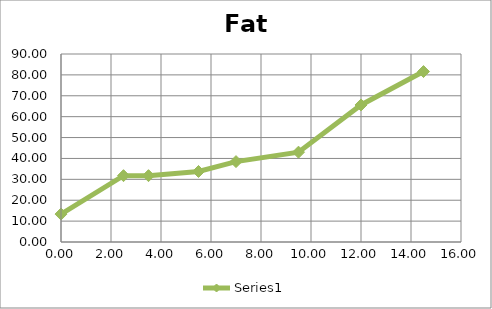
| Category | Series 0 |
|---|---|
| 0.0 | 13.372 |
| 2.5 | 31.757 |
| 3.5 | 31.757 |
| 5.5 | 33.757 |
| 7.0 | 38.487 |
| 9.5 | 42.997 |
| 12.0 | 65.597 |
| 14.5 | 81.597 |